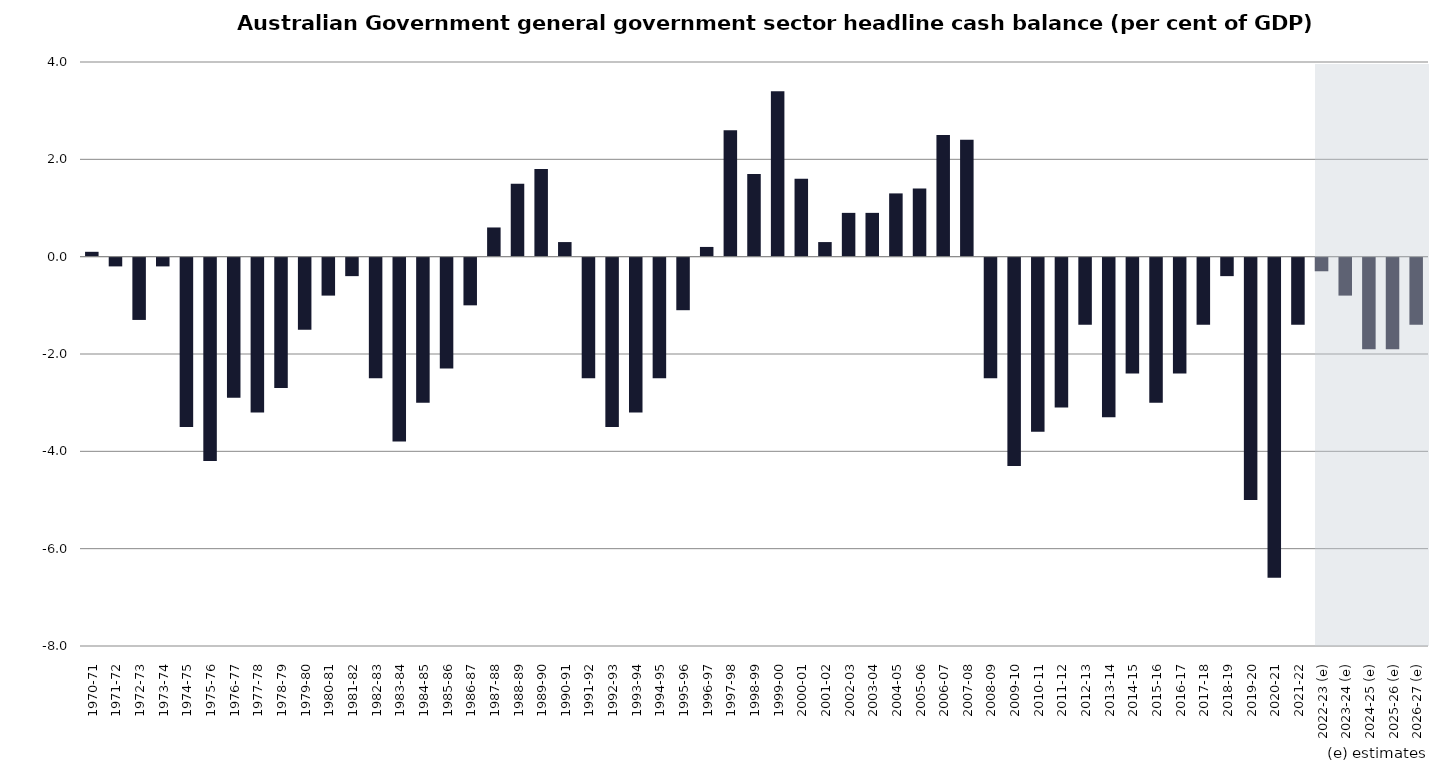
| Category | Series 0 |
|---|---|
| 1970-71 | 0.1 |
| 1971-72 | -0.2 |
| 1972-73 | -1.3 |
| 1973-74 | -0.2 |
| 1974-75 | -3.5 |
| 1975-76 | -4.2 |
| 1976-77 | -2.9 |
| 1977-78 | -3.2 |
| 1978-79 | -2.7 |
| 1979-80 | -1.5 |
| 1980-81 | -0.8 |
| 1981-82 | -0.4 |
| 1982-83 | -2.5 |
| 1983-84 | -3.8 |
| 1984-85 | -3 |
| 1985-86 | -2.3 |
| 1986-87 | -1 |
| 1987-88 | 0.6 |
| 1988-89 | 1.5 |
| 1989-90 | 1.8 |
| 1990-91 | 0.3 |
| 1991-92 | -2.5 |
| 1992-93 | -3.5 |
| 1993-94 | -3.2 |
| 1994-95 | -2.5 |
| 1995-96 | -1.1 |
| 1996-97 | 0.2 |
| 1997-98 | 2.6 |
| 1998-99 | 1.7 |
| 1999-00 | 3.4 |
| 2000-01 | 1.6 |
| 2001-02 | 0.3 |
| 2002-03 | 0.9 |
| 2003-04 | 0.9 |
| 2004-05 | 1.3 |
| 2005-06 | 1.4 |
| 2006-07 | 2.5 |
| 2007-08 | 2.4 |
| 2008-09 | -2.5 |
| 2009-10 | -4.3 |
| 2010-11 | -3.6 |
| 2011-12 | -3.1 |
| 2012-13 | -1.4 |
| 2013-14 | -3.3 |
| 2014-15 | -2.4 |
| 2015-16 | -3 |
| 2016-17 | -2.4 |
| 2017-18 | -1.4 |
| 2018-19 | -0.4 |
| 2019-20 | -5 |
| 2020-21 | -6.6 |
| 2021-22 | -1.4 |
| 2022-23 (e) | -0.3 |
| 2023-24 (e) | -0.8 |
| 2024-25 (e) | -1.9 |
| 2025-26 (e) | -1.9 |
| 2026-27 (e) | -1.4 |